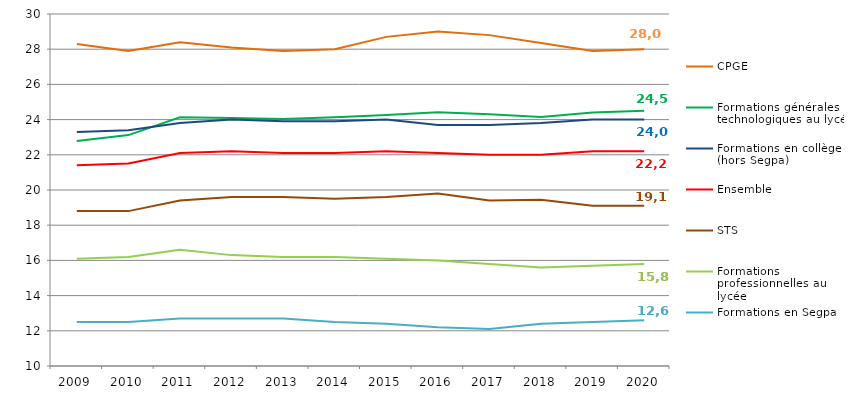
| Category | CPGE | Formations générales et technologiques au lycée | Formations en collège (hors Segpa) | Ensemble | STS | Formations professionnelles au lycée | Formations en Segpa |
|---|---|---|---|---|---|---|---|
| 2009.0 | 28.3 | 22.78 | 23.3 | 21.4 | 18.8 | 16.1 | 12.5 |
| 2010.0 | 27.9 | 23.12 | 23.4 | 21.5 | 18.8 | 16.2 | 12.5 |
| 2011.0 | 28.4 | 24.13 | 23.8 | 22.1 | 19.4 | 16.6 | 12.7 |
| 2012.0 | 28.1 | 24.09 | 24 | 22.2 | 19.6 | 16.3 | 12.7 |
| 2013.0 | 27.9 | 24.04 | 23.9 | 22.1 | 19.6 | 16.2 | 12.7 |
| 2014.0 | 28 | 24.13 | 23.9 | 22.1 | 19.5 | 16.2 | 12.5 |
| 2015.0 | 28.7 | 24.26 | 24 | 22.2 | 19.6 | 16.1 | 12.4 |
| 2016.0 | 29 | 24.42 | 23.7 | 22.1 | 19.8 | 16 | 12.2 |
| 2017.0 | 28.8 | 24.31 | 23.7 | 22 | 19.4 | 15.8 | 12.1 |
| 2018.0 | 28.35 | 24.15 | 23.8 | 22 | 19.45 | 15.6 | 12.4 |
| 2019.0 | 27.9 | 24.4 | 24 | 22.2 | 19.1 | 15.7 | 12.5 |
| 2020.0 | 28 | 24.5 | 24 | 22.2 | 19.1 | 15.8 | 12.6 |